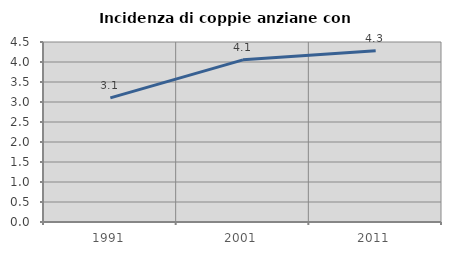
| Category | Incidenza di coppie anziane con figli |
|---|---|
| 1991.0 | 3.102 |
| 2001.0 | 4.054 |
| 2011.0 | 4.28 |